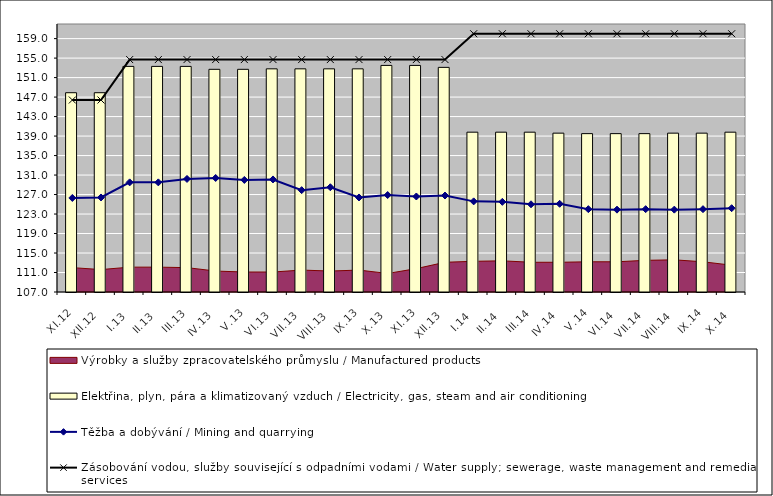
| Category | Elektřina, plyn, pára a klimatizovaný vzduch / Electricity, gas, steam and air conditioning |
|---|---|
| XI.12 | 147.9 |
| XII.12 | 147.9 |
| I.13 | 153.3 |
| II.13 | 153.3 |
| III.13 | 153.3 |
| IV.13 | 152.7 |
| V.13 | 152.7 |
| VI.13 | 152.8 |
| VII.13 | 152.8 |
| VIII.13 | 152.8 |
| IX.13 | 152.8 |
| X.13 | 153.5 |
| XI.13 | 153.5 |
| XII.13 | 153.1 |
| I.14 | 139.8 |
| II.14 | 139.8 |
| III.14 | 139.8 |
| IV.14 | 139.6 |
| V.14 | 139.5 |
| VI.14 | 139.5 |
| VII.14 | 139.5 |
| VIII.14 | 139.6 |
| IX.14 | 139.6 |
| X.14 | 139.8 |